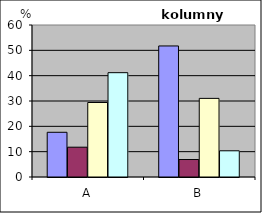
| Category | Series 0 | Series 1 | Series 2 | Series 3 |
|---|---|---|---|---|
| A | 17.647 | 11.765 | 29.412 | 41.176 |
| B | 51.724 | 6.897 | 31.034 | 10.345 |